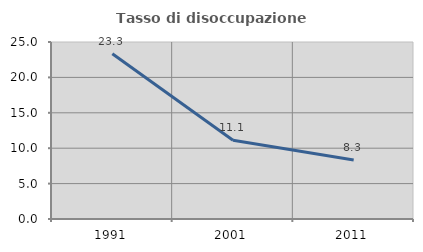
| Category | Tasso di disoccupazione giovanile  |
|---|---|
| 1991.0 | 23.333 |
| 2001.0 | 11.111 |
| 2011.0 | 8.333 |